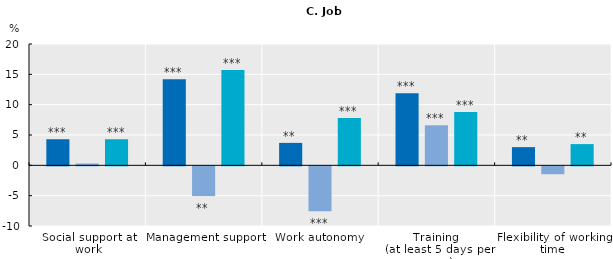
| Category | Mixed voice | Representative voice (union and non-union) | Direct voice |
|---|---|---|---|
| Social support at work | 4.3 | 0.3 | 4.3 |
| Management support | 14.2 | -4.9 | 15.7 |
| Work autonomy | 3.7 | -7.4 | 7.8 |
| Training 
(at least 5 days per year) | 11.9 | 6.6 | 8.8 |
| Flexibility of working time | 3 | -1.3 | 3.5 |